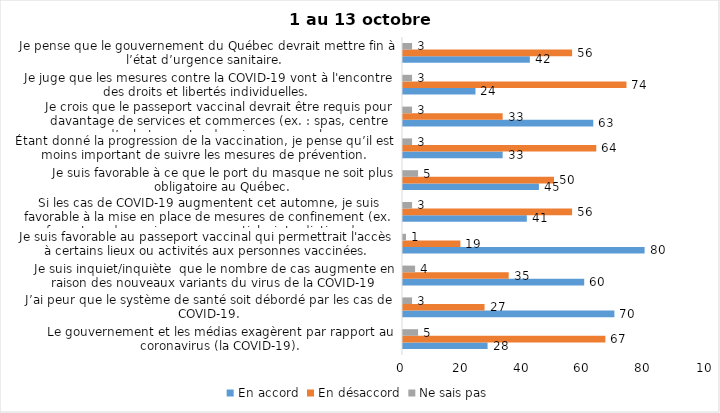
| Category | En accord | En désaccord | Ne sais pas |
|---|---|---|---|
| Le gouvernement et les médias exagèrent par rapport au coronavirus (la COVID-19). | 28 | 67 | 5 |
| J’ai peur que le système de santé soit débordé par les cas de COVID-19. | 70 | 27 | 3 |
| Je suis inquiet/inquiète  que le nombre de cas augmente en raison des nouveaux variants du virus de la COVID-19 | 60 | 35 | 4 |
| Je suis favorable au passeport vaccinal qui permettrait l'accès à certains lieux ou activités aux personnes vaccinées. | 80 | 19 | 1 |
| Si les cas de COVID-19 augmentent cet automne, je suis favorable à la mise en place de mesures de confinement (ex. fermeture de services non essentiels, interdiction des rassemblements privés) | 41 | 56 | 3 |
| Je suis favorable à ce que le port du masque ne soit plus obligatoire au Québec. | 45 | 50 | 5 |
| Étant donné la progression de la vaccination, je pense qu’il est moins important de suivre les mesures de prévention. | 33 | 64 | 3 |
| Je crois que le passeport vaccinal devrait être requis pour davantage de services et commerces (ex. : spas, centre d’achats, centre de soins personnels. | 63 | 33 | 3 |
| Je juge que les mesures contre la COVID-19 vont à l'encontre des droits et libertés individuelles.  | 24 | 74 | 3 |
| Je pense que le gouvernement du Québec devrait mettre fin à l’état d’urgence sanitaire.  | 42 | 56 | 3 |